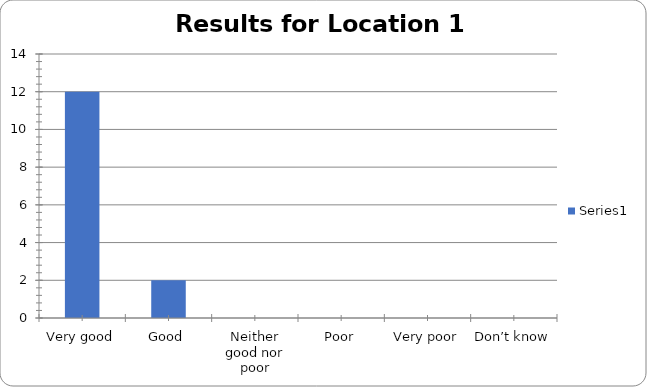
| Category | Series 0 |
|---|---|
| Very good | 12 |
| Good | 2 |
| Neither good nor poor | 0 |
| Poor | 0 |
| Very poor | 0 |
| Don’t know | 0 |